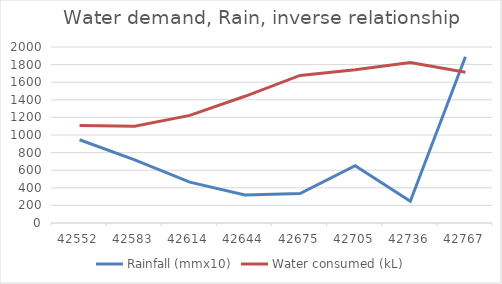
| Category | Rainfall (mmx10) | Water consumed (kL) |
|---|---|---|
| 42552.0 | 946 | 1107 |
| 42583.0 | 718 | 1100 |
| 42614.0 | 464 | 1223 |
| 42644.0 | 318 | 1440 |
| 42675.0 | 334 | 1677 |
| 42705.0 | 652 | 1741 |
| 42736.0 | 246 | 1825 |
| 42767.0 | 1890 | 1712 |